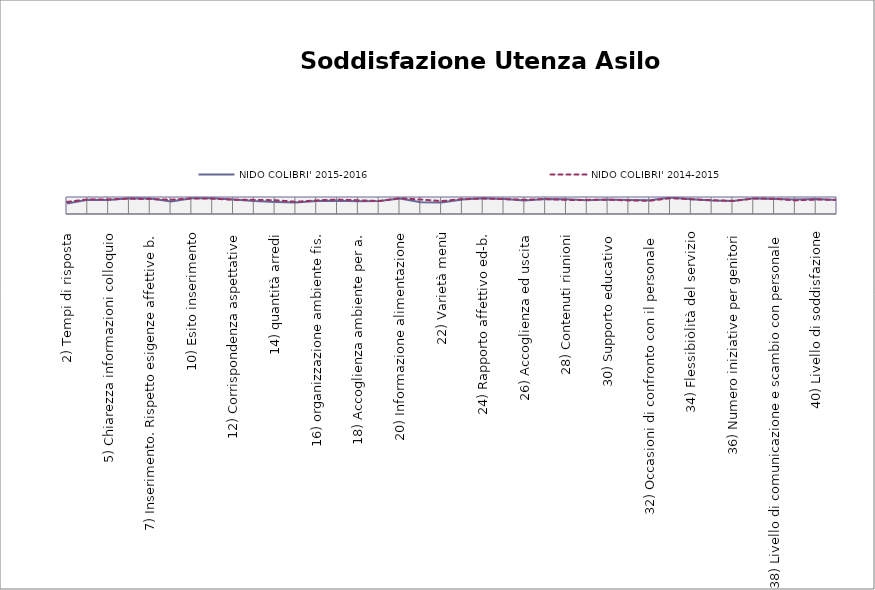
| Category | NIDO COLIBRI' 2015-2016 | NIDO COLIBRI' 2014-2015 |
|---|---|---|
| 2) Tempi di risposta | 0.615 | 0.71 |
| 4) Clima colloquio | 0.833 | 0.86 |
| 5) Chiarezza informazioni colloquio | 0.823 | 0.86 |
| 6) Rispondenza informaziomni | 0.927 | 0.9 |
| 7) Inserimento. Rispetto esigenze affettive b. | 0.917 | 0.88 |
| 9) Durata inserimento | 0.729 | 0.84 |
| 10) Esito inserimento | 0.927 | 0.92 |
| 11) Supporto e sostegno durante l'ins. | 0.927 | 0.9 |
| 12) Corrispondenza aspettative | 0.856 | 0.84 |
| 13) Igiene struttura | 0.762 | 0.83 |
| 14) quantità arredi | 0.709 | 0.81 |
| 15) qualità arredi | 0.681 | 0.72 |
| 16) organizzazione ambiente fis. | 0.769 | 0.8 |
| 17) Accoglienza ambiente per b. | 0.775 | 0.85 |
| 18) Accoglienza ambiente per a. | 0.744 | 0.81 |
| 19) Utilizzo spazi esterni | 0.762 | 0.76 |
| 20) Informazione alimentazione | 0.912 | 0.93 |
| 21)Menù adeguato all'età | 0.694 | 0.85 |
| 22) Varietà menù | 0.675 | 0.76 |
| 23) Accoglienza ambiente sociale | 0.856 | 0.88 |
| 24) Rapporto affettivo ed-b. | 0.931 | 0.91 |
| 25) Attenzione nel gruppo | 0.881 | 0.88 |
| 26) Accoglienza ed uscita | 0.8 | 0.84 |
| 27) Proposte educative: adatte all'età | 0.875 | 0.88 |
| 28) Contenuti riunioni | 0.868 | 0.83 |
| 29) Programmazione quotidianità | 0.806 | 0.83 |
| 30) Supporto educativo | 0.85 | 0.84 |
| 31) Coordinamento | 0.824 | 0.8 |
| 32) Occasioni di confronto con il personale | 0.806 | 0.78 |
| 33) Grado di autonomia | 0.969 | 0.93 |
| 34) Flessibiòlità del servizio | 0.869 | 0.87 |
| 35) Interesse per iniziative per genitori | 0.788 | 0.81 |
| 36) Numero iniziative per genitori | 0.762 | 0.77 |
| 37) Qualità dell'ascolto ed. rif. | 0.919 | 0.91 |
| 38) Livello di comunicazione e scambio con personale | 0.876 | 0.9 |
| 39) Stile e metodo comune | 0.856 | 0.8 |
| 40) Livello di soddisfazione | 0.888 | 0.85 |
| Media totale risposte | 0.822 | 0.84 |